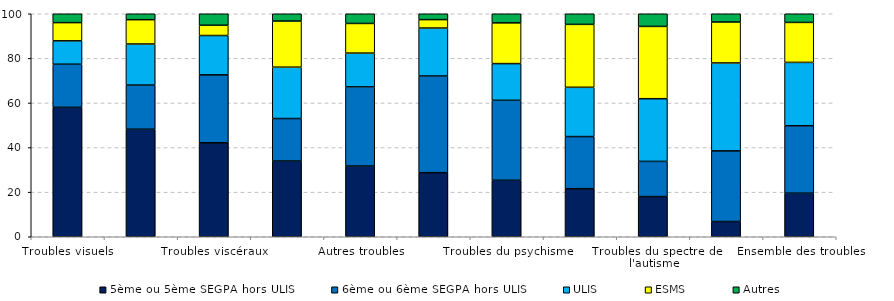
| Category | 5ème ou 5ème SEGPA hors ULIS | 6ème ou 6ème SEGPA hors ULIS | ULIS | ESMS | Autres |
|---|---|---|---|---|---|
| Troubles visuels | 58.039 | 19.336 | 10.484 | 8.162 | 3.979 |
| Troubles moteurs | 48.216 | 19.792 | 18.431 | 10.904 | 2.657 |
| Troubles viscéraux | 42.139 | 30.46 | 17.645 | 4.62 | 5.136 |
| Troubles auditifs | 33.952 | 19.058 | 23.036 | 20.685 | 3.268 |
| Autres troubles | 31.72 | 35.487 | 15.144 | 13.302 | 4.347 |
| Troubles du langage ou de la parole | 28.728 | 43.358 | 21.508 | 3.774 | 2.632 |
| Troubles du psychisme | 25.318 | 35.875 | 16.454 | 18.271 | 4.082 |
| Plusieurs troubles associés | 21.54 | 23.38 | 22.105 | 28.21 | 4.764 |
| Troubles du spectre de l'autisme | 18.015 | 15.783 | 28.101 | 32.426 | 5.674 |
| Troubles intellectuels ou cognitifs | 6.838 | 31.674 | 39.427 | 18.355 | 3.706 |
| Ensemble des troubles | 19.53 | 30.258 | 28.397 | 17.931 | 3.884 |